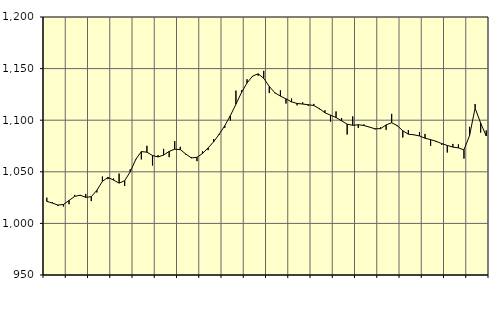
| Category | Piggar | Series 1 |
|---|---|---|
| nan | 1024.9 | 1021.36 |
| 1.0 | 1020.5 | 1019.7 |
| 1.0 | 1016.8 | 1017.78 |
| 1.0 | 1016.4 | 1018.34 |
| nan | 1018.6 | 1022.22 |
| 2.0 | 1027.6 | 1026.17 |
| 2.0 | 1026.6 | 1027.33 |
| 2.0 | 1028.5 | 1025.29 |
| nan | 1021.6 | 1025.85 |
| 3.0 | 1030 | 1032.08 |
| 3.0 | 1045.4 | 1040.68 |
| 3.0 | 1042.9 | 1044.65 |
| nan | 1043.6 | 1041.96 |
| 4.0 | 1048.3 | 1039.05 |
| 4.0 | 1036.3 | 1041.36 |
| 4.0 | 1052.4 | 1050.04 |
| nan | 1061.6 | 1062.05 |
| 5.0 | 1062 | 1069.59 |
| 5.0 | 1075.2 | 1069.02 |
| 5.0 | 1056.1 | 1065.77 |
| nan | 1066.2 | 1064.43 |
| 6.0 | 1072.2 | 1066.2 |
| 6.0 | 1064.2 | 1069.78 |
| 6.0 | 1079.7 | 1071.93 |
| nan | 1074.2 | 1071.51 |
| 7.0 | 1066.5 | 1067.18 |
| 7.0 | 1064.3 | 1063.44 |
| 7.0 | 1060.3 | 1064.03 |
| nan | 1069.9 | 1067.8 |
| 8.0 | 1071 | 1073.13 |
| 8.0 | 1081.8 | 1079.12 |
| 8.0 | 1085.7 | 1086.42 |
| nan | 1092.6 | 1094.68 |
| 9.0 | 1099.7 | 1104.4 |
| 9.0 | 1128.7 | 1115.47 |
| 9.0 | 1128.9 | 1126.77 |
| nan | 1139.7 | 1136.06 |
| 10.0 | 1142.2 | 1142.74 |
| 10.0 | 1143.1 | 1144.95 |
| 10.0 | 1147.8 | 1140.62 |
| nan | 1126.3 | 1132.73 |
| 11.0 | 1126.1 | 1126.56 |
| 11.0 | 1128.9 | 1123.35 |
| 11.0 | 1116.1 | 1120.68 |
| nan | 1121 | 1117.74 |
| 12.0 | 1114.4 | 1116.23 |
| 12.0 | 1117.3 | 1115.65 |
| 12.0 | 1113.9 | 1114.99 |
| nan | 1115.8 | 1114.23 |
| 13.0 | 1110.6 | 1111.19 |
| 13.0 | 1109.6 | 1107.23 |
| 13.0 | 1098.7 | 1104.9 |
| nan | 1108.5 | 1102.58 |
| 14.0 | 1102 | 1099.39 |
| 14.0 | 1086.1 | 1096.16 |
| 14.0 | 1103.7 | 1095.06 |
| nan | 1092.5 | 1095.58 |
| 15.0 | 1095.9 | 1094.87 |
| 15.0 | 1093.5 | 1093.32 |
| 15.0 | 1091.1 | 1091.68 |
| nan | 1093.1 | 1091.82 |
| 16.0 | 1090.7 | 1095.43 |
| 16.0 | 1106.1 | 1097.55 |
| 16.0 | 1094.2 | 1094.76 |
| nan | 1083.2 | 1089.74 |
| 17.0 | 1090.4 | 1086.46 |
| 17.0 | 1085.6 | 1085.85 |
| 17.0 | 1088.5 | 1084.73 |
| nan | 1086.7 | 1082.53 |
| 18.0 | 1075 | 1081.16 |
| 18.0 | 1078.8 | 1079.54 |
| 18.0 | 1076.1 | 1077.37 |
| nan | 1068.7 | 1075.55 |
| 19.0 | 1077 | 1073.96 |
| 19.0 | 1076.6 | 1073.17 |
| 19.0 | 1062.8 | 1071.27 |
| nan | 1093.6 | 1085.09 |
| 20.0 | 1115.7 | 1111.71 |
| 20.0 | 1088 | 1097.15 |
| 20.0 | 1090.1 | 1084.69 |